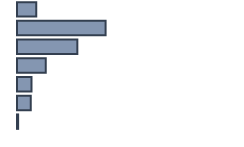
| Category | Series 0 |
|---|---|
| 0 | 8.5 |
| 1 | 39.2 |
| 2 | 26.7 |
| 3 | 12.7 |
| 4 | 6.4 |
| 5 | 6.1 |
| 6 | 0.5 |